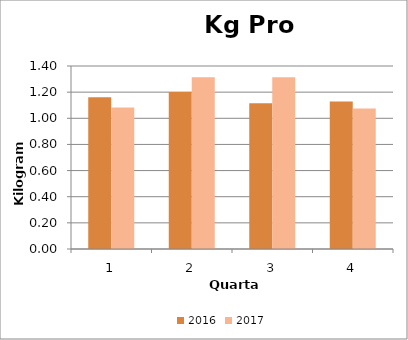
| Category | 2016 | 2017 |
|---|---|---|
| 0 | 1.162 | 1.082 |
| 1 | 1.201 | 1.314 |
| 2 | 1.115 | 1.314 |
| 3 | 1.128 | 1.075 |